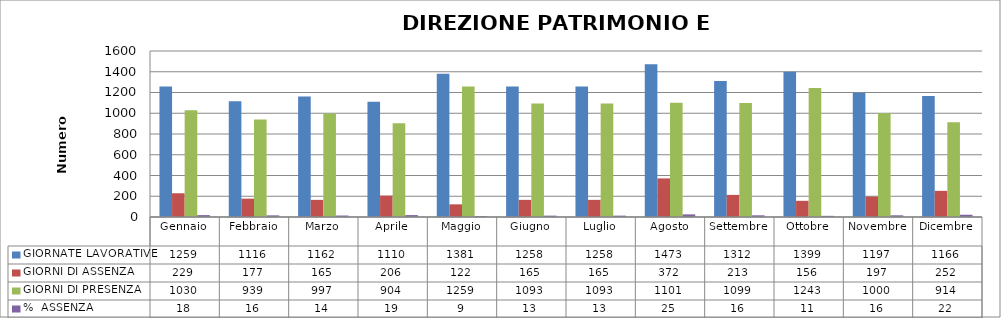
| Category | GIORNATE LAVORATIVE | GIORNI DI ASSENZA | GIORNI DI PRESENZA | %  ASSENZA |
|---|---|---|---|---|
| Gennaio | 1259 | 229 | 1030 | 18.189 |
| Febbraio | 1116 | 177 | 939 | 15.86 |
| Marzo | 1162 | 165 | 997 | 14.2 |
| Aprile | 1110 | 206 | 904 | 18.559 |
| Maggio | 1381 | 122 | 1259 | 8.834 |
| Giugno | 1258 | 165 | 1093 | 13.116 |
| Luglio | 1258 | 165 | 1093 | 13.116 |
| Agosto | 1473 | 372 | 1101 | 25.255 |
| Settembre | 1312 | 213 | 1099 | 16.235 |
| Ottobre | 1399 | 156 | 1243 | 11.151 |
| Novembre | 1197 | 197 | 1000 | 16.458 |
| Dicembre | 1166 | 252 | 914 | 21.612 |